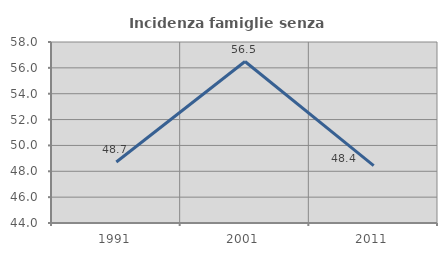
| Category | Incidenza famiglie senza nuclei |
|---|---|
| 1991.0 | 48.718 |
| 2001.0 | 56.489 |
| 2011.0 | 48.438 |